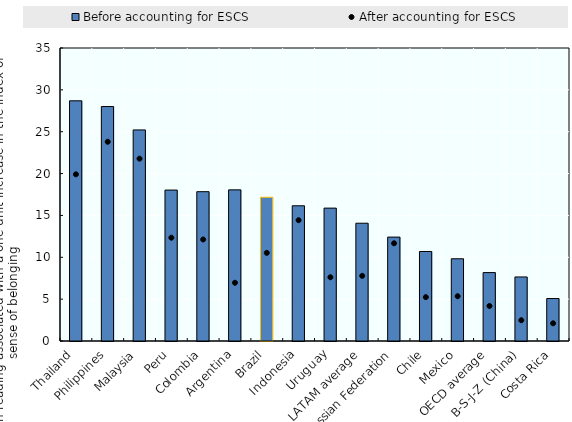
| Category | Before accounting for ESCS |
|---|---|
| Thailand | 28.692 |
| Philippines | 28.008 |
| Malaysia | 25.213 |
| Peru | 18.029 |
| Colombia | 17.838 |
| Argentina | 18.054 |
| Brazil | 17.172 |
| Indonesia | 16.153 |
| Uruguay | 15.873 |
| LATAM average | 14.069 |
| Russian Federation | 12.411 |
| Chile | 10.692 |
| Mexico | 9.823 |
| OECD average | 8.172 |
| B-S-J-Z (China) | 7.652 |
| Costa Rica | 5.073 |